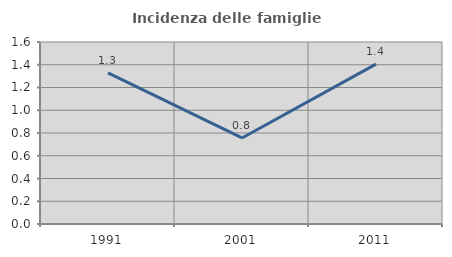
| Category | Incidenza delle famiglie numerose |
|---|---|
| 1991.0 | 1.328 |
| 2001.0 | 0.756 |
| 2011.0 | 1.405 |